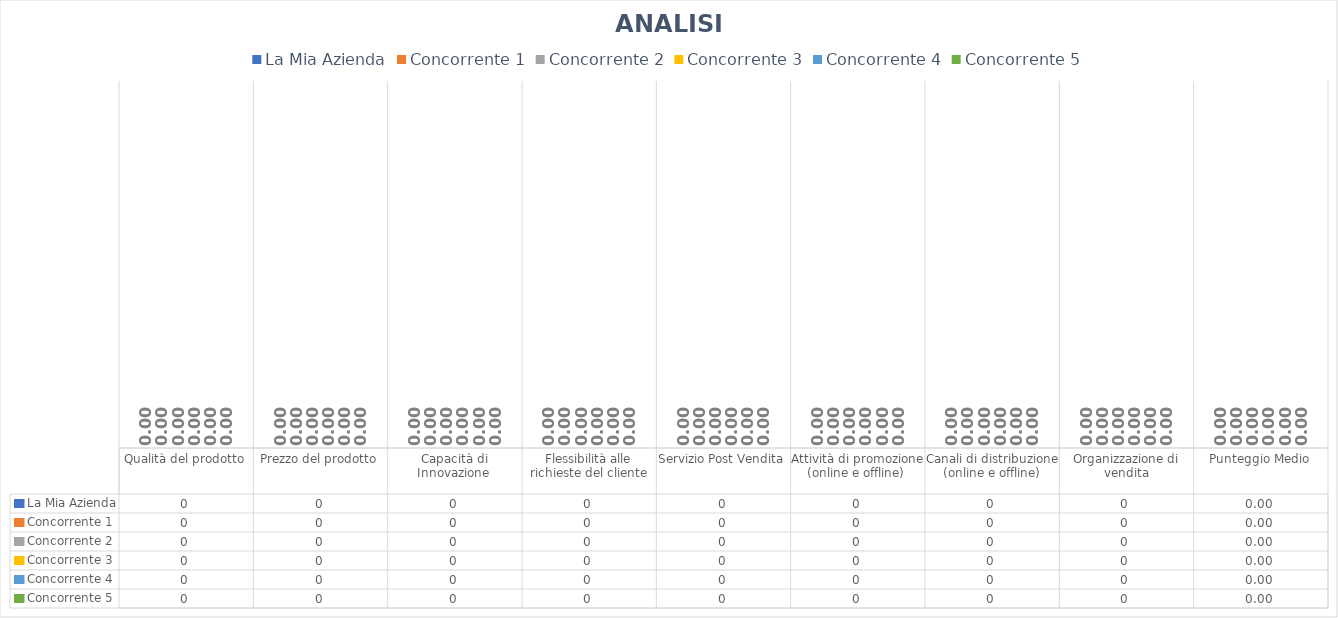
| Category | La Mia Azienda | Concorrente 1 | Concorrente 2 | Concorrente 3 | Concorrente 4 | Concorrente 5 |
|---|---|---|---|---|---|---|
| Qualità del prodotto | 0 | 0 | 0 | 0 | 0 | 0 |
| Prezzo del prodotto | 0 | 0 | 0 | 0 | 0 | 0 |
| Capacità di Innovazione  | 0 | 0 | 0 | 0 | 0 | 0 |
| Flessibilità alle richieste del cliente | 0 | 0 | 0 | 0 | 0 | 0 |
| Servizio Post Vendita | 0 | 0 | 0 | 0 | 0 | 0 |
| Attività di promozione (online e offline)  | 0 | 0 | 0 | 0 | 0 | 0 |
| Canali di distribuzione (online e offline) | 0 | 0 | 0 | 0 | 0 | 0 |
| Organizzazione di vendita | 0 | 0 | 0 | 0 | 0 | 0 |
| Punteggio Medio | 0 | 0 | 0 | 0 | 0 | 0 |